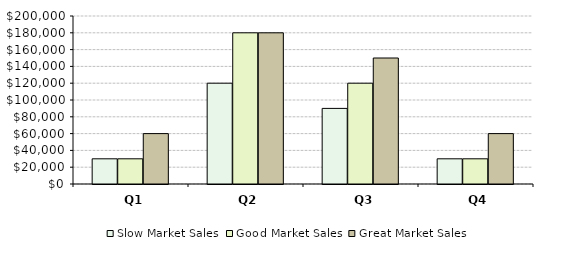
| Category | Slow Market Sales | Good Market Sales | Great Market Sales |
|---|---|---|---|
| Q1 | 30000 | 30000 | 60000 |
| Q2 | 120000 | 180000 | 180000 |
| Q3 | 90000 | 120000 | 150000 |
| Q4 | 30000 | 30000 | 60000 |